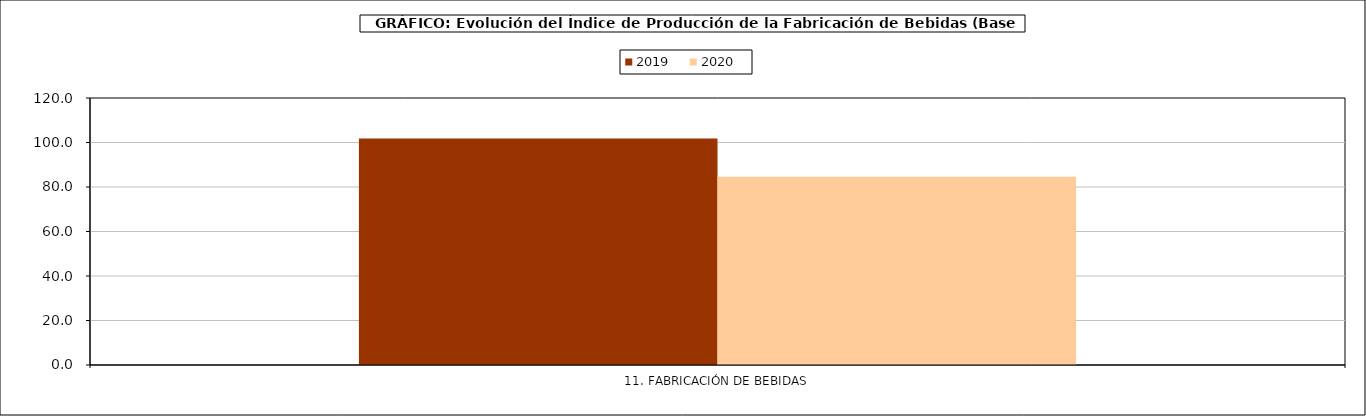
| Category | 2019 | 2020 |
|---|---|---|
| 0 | 101.821 | 84.658 |